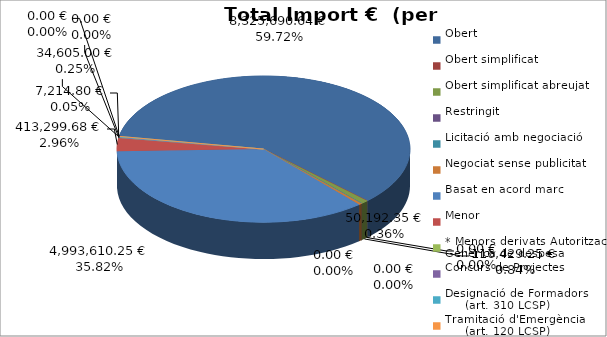
| Category | Total preu
(amb IVA) |
|---|---|
| Obert | 8325690.64 |
| Obert simplificat | 0 |
| Obert simplificat abreujat | 116429.25 |
| Restringit | 0 |
| Licitació amb negociació | 0 |
| Negociat sense publicitat | 50192.35 |
| Basat en acord marc | 4993610.25 |
| Menor | 413299.68 |
| * Menors derivats Autorització Genèrica de despesa | 7214.8 |
| Concurs de Projectes | 0 |
| Designació de Formadors
     (art. 310 LCSP) | 34605 |
| Tramitació d'Emergència
     (art. 120 LCSP) | 0 |